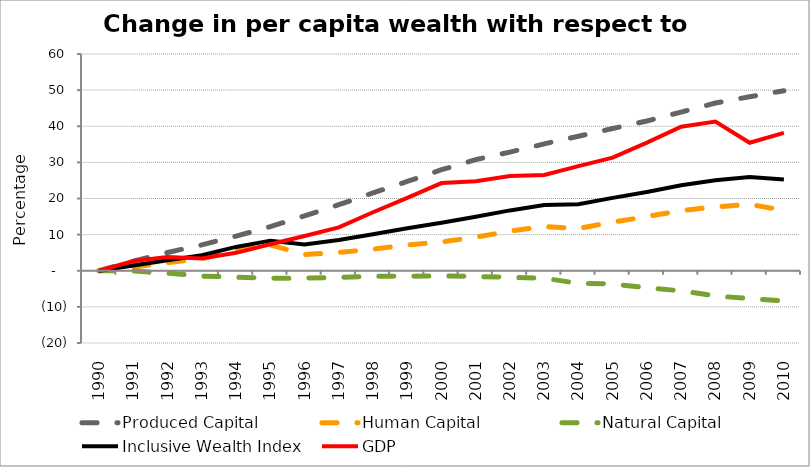
| Category | Produced Capital  | Human Capital | Natural Capital | Inclusive Wealth Index | GDP |
|---|---|---|---|---|---|
| 1990.0 | 0 | 0 | 0 | 0 | 0 |
| 1991.0 | 2.655 | 1.02 | -0.027 | 1.445 | 2.681 |
| 1992.0 | 5.054 | 2.21 | -0.67 | 2.927 | 3.831 |
| 1993.0 | 7.161 | 3.357 | -1.474 | 4.294 | 3.403 |
| 1994.0 | 9.587 | 5.691 | -1.767 | 6.595 | 4.961 |
| 1995.0 | 12.195 | 7.153 | -2.077 | 8.332 | 7.333 |
| 1996.0 | 15.201 | 4.475 | -2.052 | 7.276 | 9.637 |
| 1997.0 | 18.28 | 5.054 | -1.811 | 8.534 | 12.013 |
| 1998.0 | 21.553 | 5.978 | -1.518 | 10.089 | 16.186 |
| 1999.0 | 24.708 | 7.136 | -1.541 | 11.769 | 20.169 |
| 2000.0 | 27.967 | 7.986 | -1.413 | 13.265 | 24.265 |
| 2001.0 | 30.751 | 9.291 | -1.597 | 14.943 | 24.804 |
| 2002.0 | 32.853 | 10.981 | -1.804 | 16.704 | 26.218 |
| 2003.0 | 35.111 | 12.228 | -2.06 | 18.195 | 26.51 |
| 2004.0 | 37.246 | 11.71 | -3.488 | 18.385 | 28.972 |
| 2005.0 | 39.373 | 13.436 | -3.65 | 20.179 | 31.32 |
| 2006.0 | 41.457 | 14.994 | -4.733 | 21.823 | 35.464 |
| 2007.0 | 43.93 | 16.66 | -5.557 | 23.655 | 39.866 |
| 2008.0 | 46.44 | 17.676 | -6.976 | 25.028 | 41.275 |
| 2009.0 | 48.169 | 18.368 | -7.695 | 25.973 | 35.44 |
| 2010.0 | 49.842 | 16.73 | -8.374 | 25.266 | 38.179 |